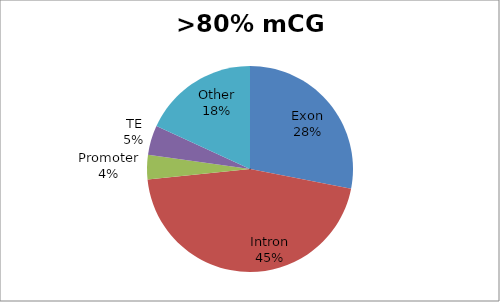
| Category | >80% mCG |
|---|---|
| Exon | 313602 |
| Intron | 506264 |
| Promoter | 42562 |
| TE | 52064 |
| Other | 202647 |